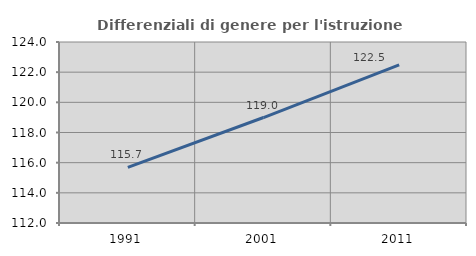
| Category | Differenziali di genere per l'istruzione superiore |
|---|---|
| 1991.0 | 115.692 |
| 2001.0 | 118.993 |
| 2011.0 | 122.48 |